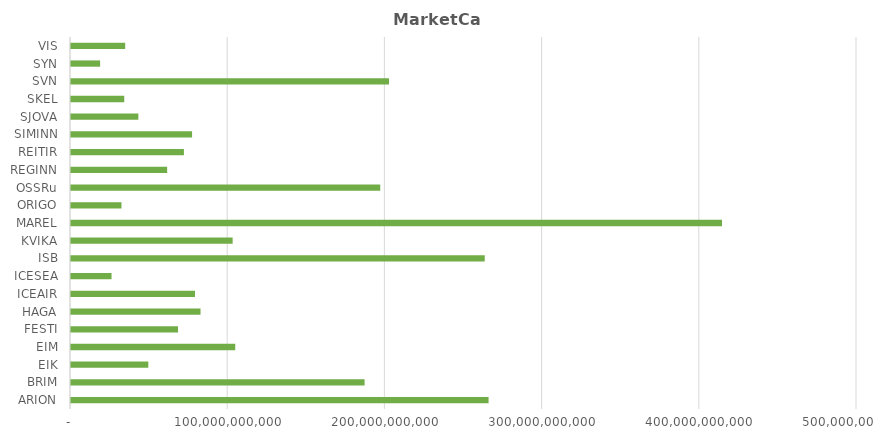
| Category | Series 0 |
|---|---|
| ARION | 265639271388 |
| BRIM | 186764691333 |
| EIK | 49176913464 |
| EIM | 104486102730 |
| FESTI | 68073500000 |
| HAGA | 82393353986 |
| ICEAIR | 78878075128.47 |
| ICESEA | 25787559724.5 |
| ISB | 263200000000 |
| KVIKA | 102834474631.2 |
| MAREL | 414119728928 |
| ORIGO | 32104513342.5 |
| OSSRu | 196723226250 |
| REGINN | 61162687586 |
| REITIR | 71829201251.5 |
| SIMINN | 77013572018.4 |
| SJOVA | 42841638688.4 |
| SKEL | 33880591045 |
| SVN | 202287148000 |
| SYN | 18518010378 |
| VIS | 34475000000 |